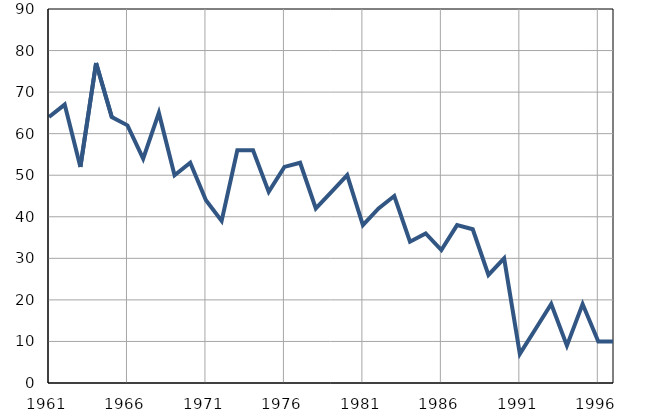
| Category | Умрла 
одојчад |
|---|---|
| 1961.0 | 64 |
| 1962.0 | 67 |
| 1963.0 | 52 |
| 1964.0 | 77 |
| 1965.0 | 64 |
| 1966.0 | 62 |
| 1967.0 | 54 |
| 1968.0 | 65 |
| 1969.0 | 50 |
| 1970.0 | 53 |
| 1971.0 | 44 |
| 1972.0 | 39 |
| 1973.0 | 56 |
| 1974.0 | 56 |
| 1975.0 | 46 |
| 1976.0 | 52 |
| 1977.0 | 53 |
| 1978.0 | 42 |
| 1979.0 | 46 |
| 1980.0 | 50 |
| 1981.0 | 38 |
| 1982.0 | 42 |
| 1983.0 | 45 |
| 1984.0 | 34 |
| 1985.0 | 36 |
| 1986.0 | 32 |
| 1987.0 | 38 |
| 1988.0 | 37 |
| 1989.0 | 26 |
| 1990.0 | 30 |
| 1991.0 | 7 |
| 1992.0 | 13 |
| 1993.0 | 19 |
| 1994.0 | 9 |
| 1995.0 | 19 |
| 1996.0 | 10 |
| 1997.0 | 10 |